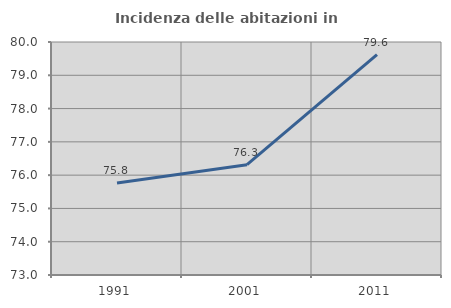
| Category | Incidenza delle abitazioni in proprietà  |
|---|---|
| 1991.0 | 75.761 |
| 2001.0 | 76.314 |
| 2011.0 | 79.623 |